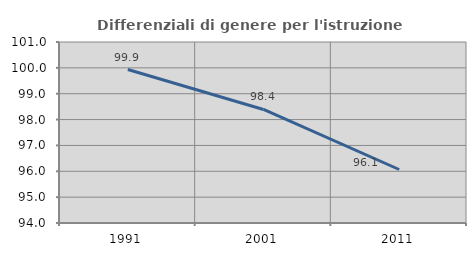
| Category | Differenziali di genere per l'istruzione superiore |
|---|---|
| 1991.0 | 99.935 |
| 2001.0 | 98.39 |
| 2011.0 | 96.069 |